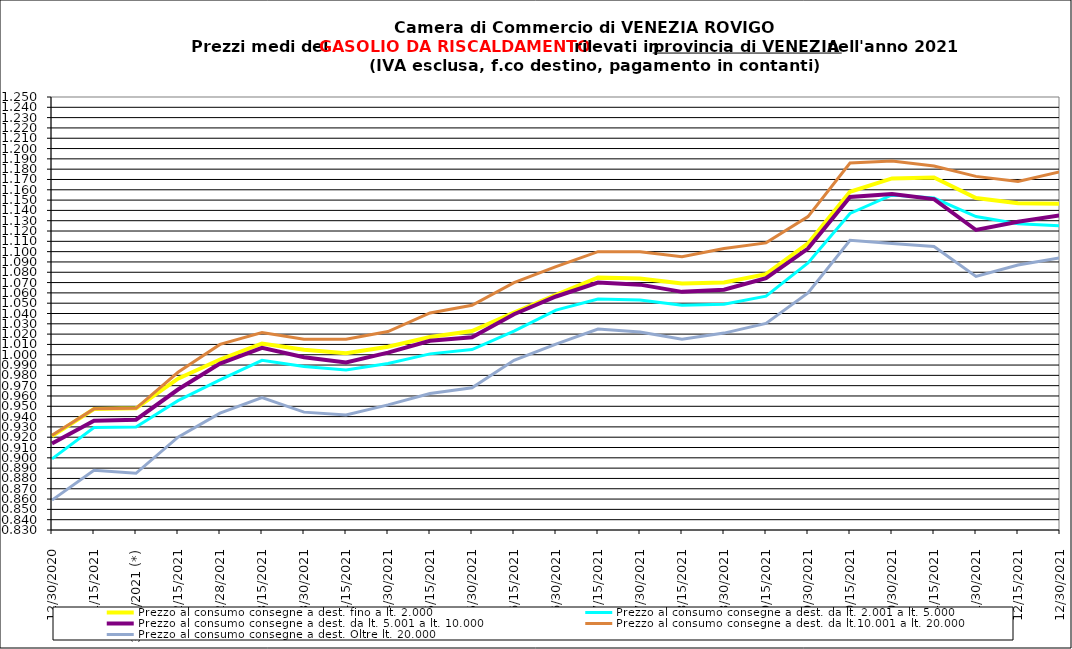
| Category | Prezzo al consumo consegne a dest. fino a lt. 2.000 | Prezzo al consumo consegne a dest. da lt. 2.001 a lt. 5.000 | Prezzo al consumo consegne a dest. da lt. 5.001 a lt. 10.000 | Prezzo al consumo consegne a dest. da lt.10.001 a lt. 20.000 | Prezzo al consumo consegne a dest. Oltre lt. 20.000 |
|---|---|---|---|---|---|
| 30/12/2020 | 0.921 | 0.899 | 0.914 | 0.922 | 0.859 |
| 15/01/2021 | 0.947 | 0.929 | 0.936 | 0.948 | 0.888 |
| 30/01/2021 (*) | 0.948 | 0.93 | 0.937 | 0.948 | 0.885 |
| 15/02/2021 | 0.977 | 0.956 | 0.966 | 0.983 | 0.92 |
| 28/02/2021 | 0.995 | 0.976 | 0.992 | 1.01 | 0.943 |
| 15/03/2021 | 1.011 | 0.995 | 1.007 | 1.022 | 0.958 |
| 30/03/2021 | 1.005 | 0.988 | 0.997 | 1.015 | 0.944 |
| 15/04/2021 | 1.001 | 0.985 | 0.992 | 1.015 | 0.942 |
| 30/04/2021 | 1.008 | 0.991 | 1.002 | 1.022 | 0.951 |
| 15/05/2021 | 1.017 | 1.001 | 1.014 | 1.04 | 0.962 |
| 30/05/2021 | 1.023 | 1.005 | 1.017 | 1.048 | 0.968 |
| 15/06/2021 | 1.041 | 1.023 | 1.039 | 1.07 | 0.995 |
| 30/06/2021 | 1.058 | 1.043 | 1.056 | 1.086 | 1.01 |
| 15/07/2021 | 1.075 | 1.054 | 1.07 | 1.1 | 1.025 |
| 30/07/2021 | 1.074 | 1.053 | 1.068 | 1.1 | 1.022 |
| 15/08/2021 | 1.069 | 1.048 | 1.061 | 1.095 | 1.015 |
| 30/08/2021 | 1.07 | 1.049 | 1.063 | 1.103 | 1.021 |
| 15/09/2021 | 1.078 | 1.057 | 1.074 | 1.108 | 1.03 |
| 30/09/2021 | 1.108 | 1.089 | 1.103 | 1.134 | 1.06 |
| 15/10/2021 | 1.158 | 1.137 | 1.153 | 1.186 | 1.111 |
| 30/10/2021 | 1.171 | 1.155 | 1.156 | 1.188 | 1.108 |
| 15/11/2021 | 1.172 | 1.152 | 1.151 | 1.183 | 1.105 |
| 30/11/2021 | 1.152 | 1.134 | 1.121 | 1.173 | 1.076 |
| 15/12/2021 | 1.147 | 1.127 | 1.129 | 1.168 | 1.087 |
| 30/12/2021 | 1.146 | 1.125 | 1.135 | 1.178 | 1.094 |